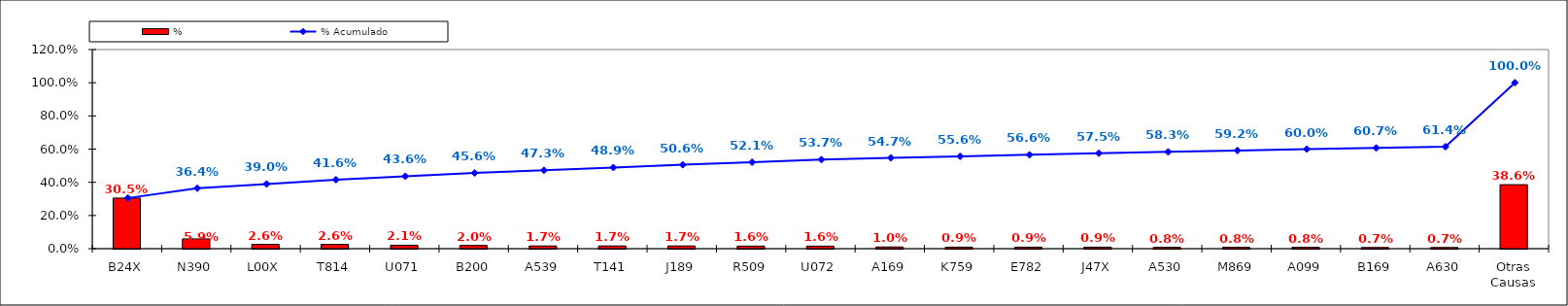
| Category | % |
|---|---|
| B24X | 0.305 |
| N390 | 0.059 |
| L00X | 0.026 |
| T814 | 0.026 |
| U071 | 0.021 |
| B200 | 0.02 |
| A539 | 0.017 |
| T141 | 0.017 |
| J189 | 0.017 |
| R509 | 0.016 |
| U072 | 0.016 |
| A169 | 0.01 |
| K759 | 0.009 |
| E782 | 0.009 |
| J47X | 0.009 |
| A530 | 0.008 |
| M869 | 0.008 |
| A099 | 0.008 |
| B169 | 0.007 |
| A630 | 0.007 |
| Otras Causas | 0.386 |